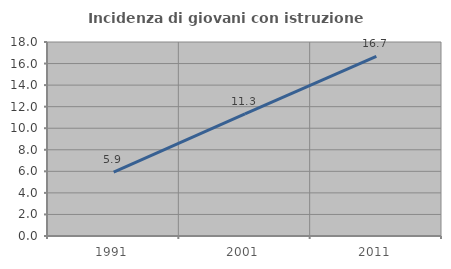
| Category | Incidenza di giovani con istruzione universitaria |
|---|---|
| 1991.0 | 5.926 |
| 2001.0 | 11.333 |
| 2011.0 | 16.667 |